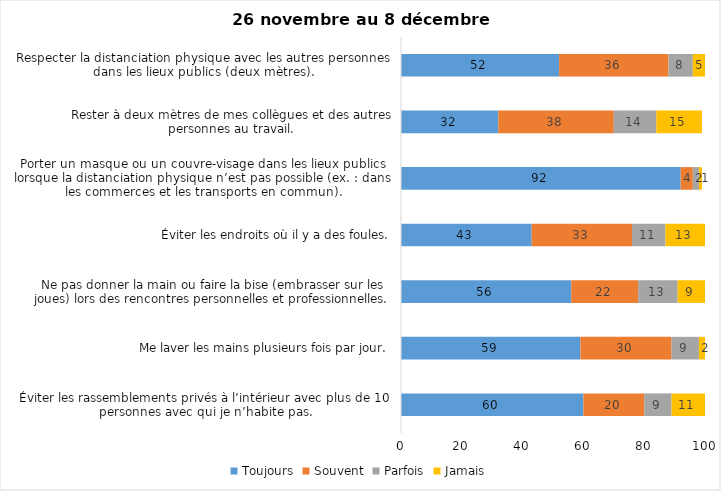
| Category | Toujours | Souvent | Parfois | Jamais |
|---|---|---|---|---|
| Éviter les rassemblements privés à l’intérieur avec plus de 10 personnes avec qui je n’habite pas. | 60 | 20 | 9 | 11 |
| Me laver les mains plusieurs fois par jour. | 59 | 30 | 9 | 2 |
| Ne pas donner la main ou faire la bise (embrasser sur les joues) lors des rencontres personnelles et professionnelles. | 56 | 22 | 13 | 9 |
| Éviter les endroits où il y a des foules. | 43 | 33 | 11 | 13 |
| Porter un masque ou un couvre-visage dans les lieux publics lorsque la distanciation physique n’est pas possible (ex. : dans les commerces et les transports en commun). | 92 | 4 | 2 | 1 |
| Rester à deux mètres de mes collègues et des autres personnes au travail. | 32 | 38 | 14 | 15 |
| Respecter la distanciation physique avec les autres personnes dans les lieux publics (deux mètres). | 52 | 36 | 8 | 5 |